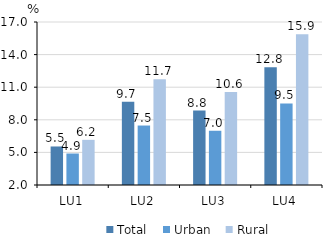
| Category | Total | Urban | Rural |
|---|---|---|---|
| LU1 | 5.545 | 4.898 | 6.155 |
| LU2 | 9.672 | 7.473 | 11.743 |
| LU3 | 8.847 | 6.99 | 10.552 |
| LU4 | 12.829 | 9.509 | 15.877 |